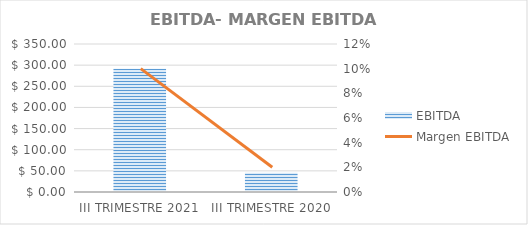
| Category | EBITDA | Autonomía |
|---|---|---|
| III TRIMESTRE 2021 | 291.575 |  |
| III TRIMESTRE 2020 | 45.374 |  |